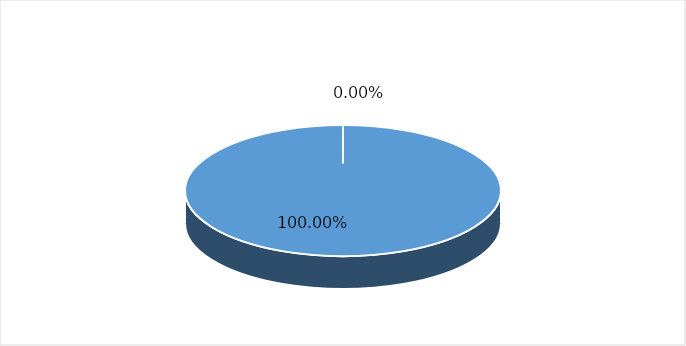
| Category | Series 0 | Series 1 |
|---|---|---|
| Nacional | 1 | 1 |
| Extranjero | 0 | 0 |